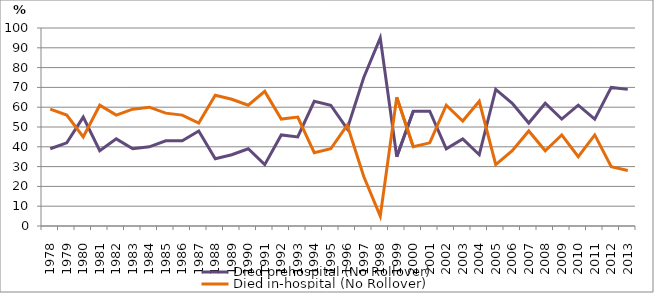
| Category | Died prehospital (No Rollover) | Died in-hospital (No Rollover) |
|---|---|---|
| 1978.0 | 39 | 59 |
| 1979.0 | 42 | 56 |
| 1980.0 | 55 | 45 |
| 1981.0 | 38 | 61 |
| 1982.0 | 44 | 56 |
| 1983.0 | 39 | 59 |
| 1984.0 | 40 | 60 |
| 1985.0 | 43 | 57 |
| 1986.0 | 43 | 56 |
| 1987.0 | 48 | 52 |
| 1988.0 | 34 | 66 |
| 1989.0 | 36 | 64 |
| 1990.0 | 39 | 61 |
| 1991.0 | 31 | 68 |
| 1992.0 | 46 | 54 |
| 1993.0 | 45 | 55 |
| 1994.0 | 63 | 37 |
| 1995.0 | 61 | 39 |
| 1996.0 | 49 | 51 |
| 1997.0 | 75 | 25 |
| 1998.0 | 95 | 5 |
| 1999.0 | 35 | 65 |
| 2000.0 | 58 | 40 |
| 2001.0 | 58 | 42 |
| 2002.0 | 39 | 61 |
| 2003.0 | 44 | 53 |
| 2004.0 | 36 | 63 |
| 2005.0 | 69 | 31 |
| 2006.0 | 62 | 38 |
| 2007.0 | 52 | 48 |
| 2008.0 | 62 | 38 |
| 2009.0 | 54 | 46 |
| 2010.0 | 61 | 35 |
| 2011.0 | 54 | 46 |
| 2012.0 | 70 | 30 |
| 2013.0 | 69 | 28 |